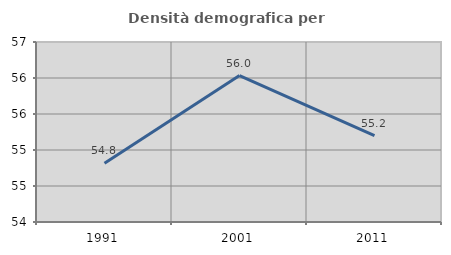
| Category | Densità demografica |
|---|---|
| 1991.0 | 54.814 |
| 2001.0 | 56.034 |
| 2011.0 | 55.2 |